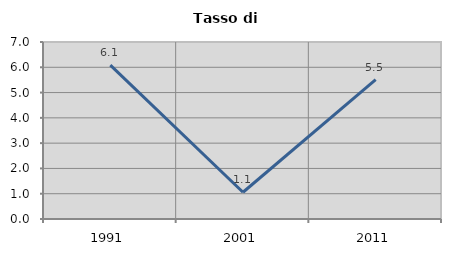
| Category | Tasso di disoccupazione   |
|---|---|
| 1991.0 | 6.087 |
| 2001.0 | 1.058 |
| 2011.0 | 5.508 |